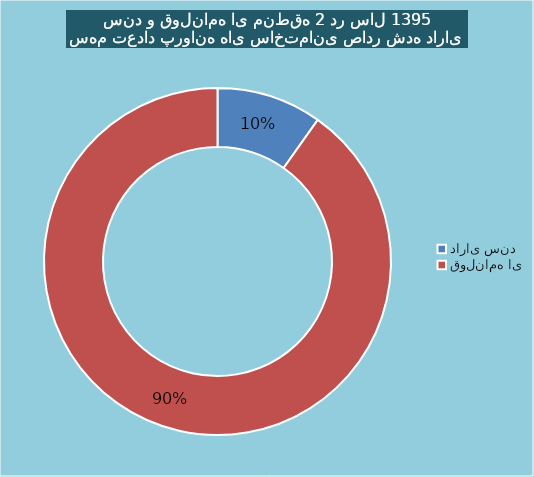
| Category | Series 0 |
|---|---|
| دارای سند | 40 |
| قولنامه ای | 368 |